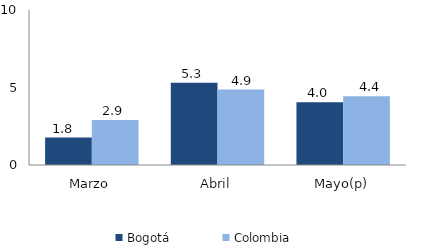
| Category | Bogotá | Colombia |
|---|---|---|
| Marzo | 1.774 | 2.899 |
| Abril | 5.31 | 4.868 |
| Mayo(p) | 4.049 | 4.443 |